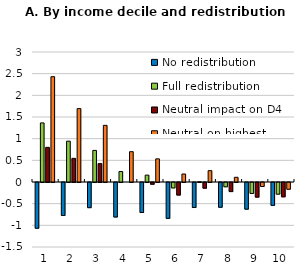
| Category | No redistribution | Full redistribution | Neutral impact on D4 | Neutral on highest regional D4 |
|---|---|---|---|---|
| 0 | -1.055 | 1.363 | 0.8 | 2.431 |
| 1 | -0.761 | 0.942 | 0.546 | 1.694 |
| 2 | -0.58 | 0.729 | 0.424 | 1.307 |
| 3 | -0.796 | 0.242 | 0 | 0.699 |
| 4 | -0.692 | 0.159 | -0.04 | 0.534 |
| 5 | -0.828 | -0.125 | -0.289 | 0.185 |
| 6 | -0.578 | 0.005 | -0.131 | 0.262 |
| 7 | -0.571 | -0.1 | -0.209 | 0.109 |
| 8 | -0.615 | -0.252 | -0.337 | -0.092 |
| 9 | -0.527 | -0.27 | -0.33 | -0.156 |